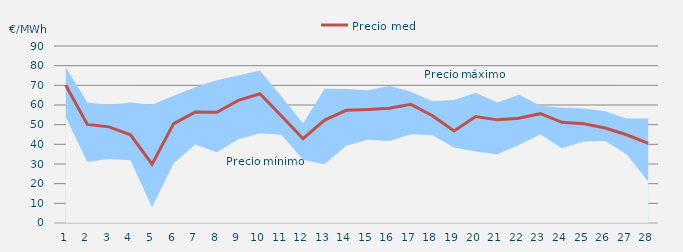
| Category | Precio medio |
|---|---|
| 0 | 70.082 |
| 1 | 50.153 |
| 2 | 48.884 |
| 3 | 44.82 |
| 4 | 29.909 |
| 5 | 50.546 |
| 6 | 56.413 |
| 7 | 56.314 |
| 8 | 62.331 |
| 9 | 65.705 |
| 10 | 54.438 |
| 11 | 42.881 |
| 12 | 52.356 |
| 13 | 57.302 |
| 14 | 57.737 |
| 15 | 58.342 |
| 16 | 60.318 |
| 17 | 54.536 |
| 18 | 46.842 |
| 19 | 54.151 |
| 20 | 52.444 |
| 21 | 53.254 |
| 22 | 55.593 |
| 23 | 51.176 |
| 24 | 50.522 |
| 25 | 48.298 |
| 26 | 44.869 |
| 27 | 40.441 |